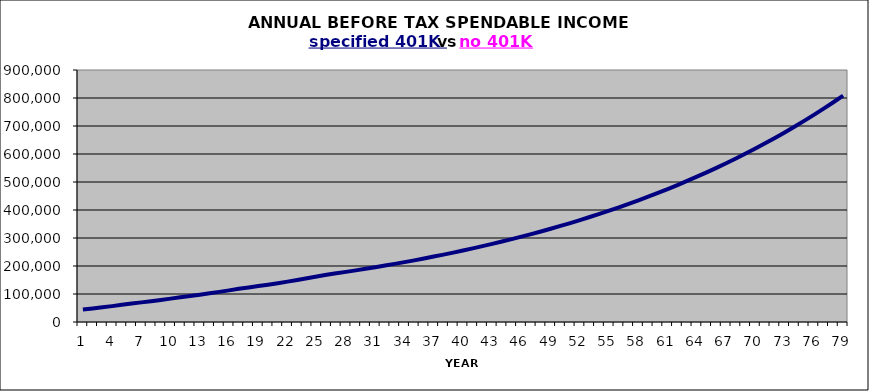
| Category | Series 0 | Series 1 |
|---|---|---|
| 0 | 45000 |  |
| 1 | 48600 |  |
| 2 | 52488 |  |
| 3 | 56687.04 |  |
| 4 | 61222.003 |  |
| 5 | 66119.763 |  |
| 6 | 70086.949 |  |
| 7 | 74292.166 |  |
| 8 | 78749.696 |  |
| 9 | 83474.678 |  |
| 10 | 88483.159 |  |
| 11 | 92907.317 |  |
| 12 | 97552.682 |  |
| 13 | 102430.317 |  |
| 14 | 107551.832 |  |
| 15 | 112929.424 |  |
| 16 | 118575.895 |  |
| 17 | 123318.931 |  |
| 18 | 128251.688 |  |
| 19 | 133381.756 |  |
| 20 | 138717.026 |  |
| 21 | 144265.707 |  |
| 22 | 150036.335 |  |
| 23 | 156037.789 |  |
| 24 | 162279.3 |  |
| 25 | 168770.472 |  |
| 26 | 173833.586 |  |
| 27 | 179048.594 |  |
| 28 | 184420.052 |  |
| 29 | 189952.653 |  |
| 30 | 195651.233 |  |
| 31 | 201520.77 |  |
| 32 | 207566.393 |  |
| 33 | 213793.385 |  |
| 34 | 220207.186 |  |
| 35 | 226813.402 |  |
| 36 | 233617.804 |  |
| 37 | 240626.338 |  |
| 38 | 247845.128 |  |
| 39 | 255280.482 |  |
| 40 | 262938.897 |  |
| 41 | 270827.064 |  |
| 42 | 278951.875 |  |
| 43 | 287320.432 |  |
| 44 | 295940.045 |  |
| 45 | 304818.246 |  |
| 46 | 313962.793 |  |
| 47 | 323381.677 |  |
| 48 | 333083.128 |  |
| 49 | 343075.621 |  |
| 50 | 353367.89 |  |
| 51 | 363968.927 |  |
| 52 | 374887.994 |  |
| 53 | 386134.634 |  |
| 54 | 397718.673 |  |
| 55 | 409650.234 |  |
| 56 | 421939.741 |  |
| 57 | 434597.933 |  |
| 58 | 447635.871 |  |
| 59 | 461064.947 |  |
| 60 | 474896.895 |  |
| 61 | 489143.802 |  |
| 62 | 503818.116 |  |
| 63 | 518932.66 |  |
| 64 | 534500.639 |  |
| 65 | 550535.659 |  |
| 66 | 567051.728 |  |
| 67 | 584063.28 |  |
| 68 | 601585.179 |  |
| 69 | 619632.734 |  |
| 70 | 638221.716 |  |
| 71 | 657368.368 |  |
| 72 | 677089.419 |  |
| 73 | 697402.101 |  |
| 74 | 718324.164 |  |
| 75 | 739873.889 |  |
| 76 | 762070.106 |  |
| 77 | 784932.209 |  |
| 78 | 808480.175 |  |